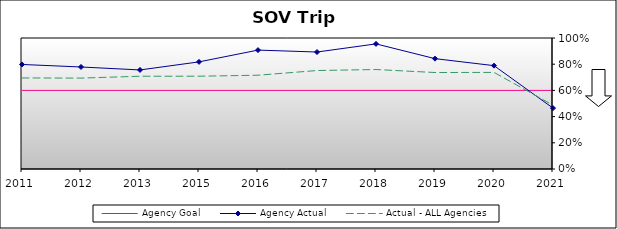
| Category | Agency Goal | Agency Actual | Actual - ALL Agencies |
|---|---|---|---|
| 2011.0 | 0.6 | 0.798 | 0.695 |
| 2012.0 | 0.6 | 0.779 | 0.694 |
| 2013.0 | 0.6 | 0.756 | 0.708 |
| 2015.0 | 0.6 | 0.818 | 0.708 |
| 2016.0 | 0.6 | 0.908 | 0.716 |
| 2017.0 | 0.6 | 0.893 | 0.752 |
| 2018.0 | 0.6 | 0.955 | 0.759 |
| 2019.0 | 0.6 | 0.842 | 0.736 |
| 2020.0 | 0.6 | 0.789 | 0.737 |
| 2021.0 | 0.6 | 0.465 | 0.487 |